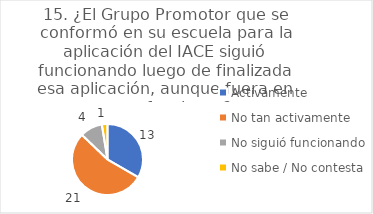
| Category | 15. ¿El Grupo Promotor que se conformó en su escuela para la aplicación del IACE siguió funcionando luego de finalizada esa aplicación, aunque fuera en otras funciones? |
|---|---|
| Activamente  | 0.333 |
| No tan activamente  | 0.538 |
| No siguió funcionando  | 0.103 |
| No sabe / No contesta | 0.026 |